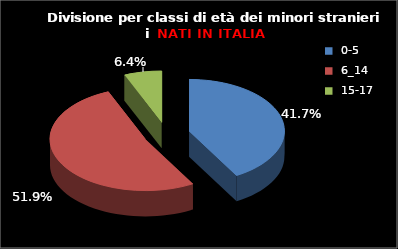
| Category | Series 0 |
|---|---|
| 0-5 | 118 |
| 6_14 | 147 |
| 15-17 | 18 |